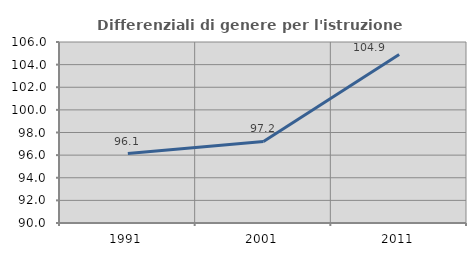
| Category | Differenziali di genere per l'istruzione superiore |
|---|---|
| 1991.0 | 96.142 |
| 2001.0 | 97.212 |
| 2011.0 | 104.891 |